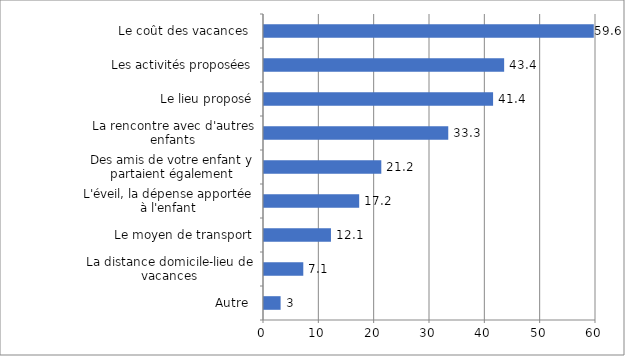
| Category | Series 0 |
|---|---|
| Autre  | 3 |
| La distance domicile-lieu de vacances | 7.1 |
| Le moyen de transport | 12.1 |
| L'éveil, la dépense apportée à l'enfant | 17.2 |
| Des amis de votre enfant y partaient également | 21.2 |
| La rencontre avec d'autres enfants | 33.3 |
| Le lieu proposé | 41.4 |
| Les activités proposées | 43.4 |
| Le coût des vacances  | 59.6 |